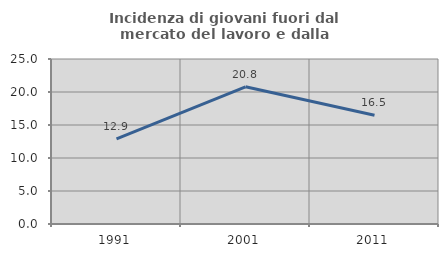
| Category | Incidenza di giovani fuori dal mercato del lavoro e dalla formazione  |
|---|---|
| 1991.0 | 12.89 |
| 2001.0 | 20.789 |
| 2011.0 | 16.471 |